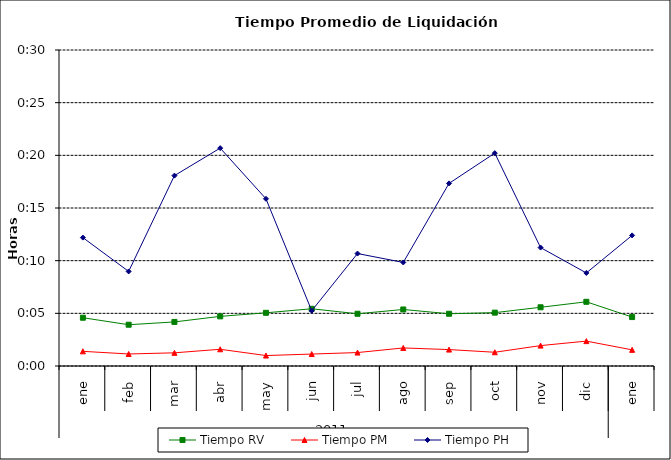
| Category | Tiempo RV | Tiempo PM | Tiempo PH |
|---|---|---|---|
| 0 | 0.003 | 0.001 | 0.009 |
| 1 | 0.003 | 0.001 | 0.006 |
| 2 | 0.003 | 0.001 | 0.013 |
| 3 | 0.003 | 0.001 | 0.014 |
| 4 | 0.004 | 0.001 | 0.011 |
| 5 | 0.004 | 0.001 | 0.004 |
| 6 | 0.003 | 0.001 | 0.007 |
| 7 | 0.004 | 0.001 | 0.007 |
| 8 | 0.003 | 0.001 | 0.012 |
| 9 | 0.004 | 0.001 | 0.014 |
| 10 | 0.004 | 0.001 | 0.008 |
| 11 | 0.004 | 0.002 | 0.006 |
| 12 | 0.003 | 0.001 | 0.009 |